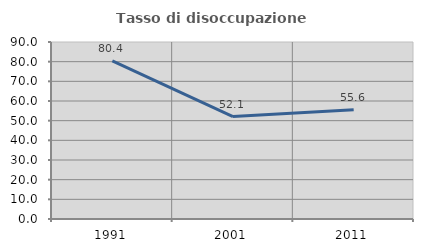
| Category | Tasso di disoccupazione giovanile  |
|---|---|
| 1991.0 | 80.392 |
| 2001.0 | 52.083 |
| 2011.0 | 55.556 |